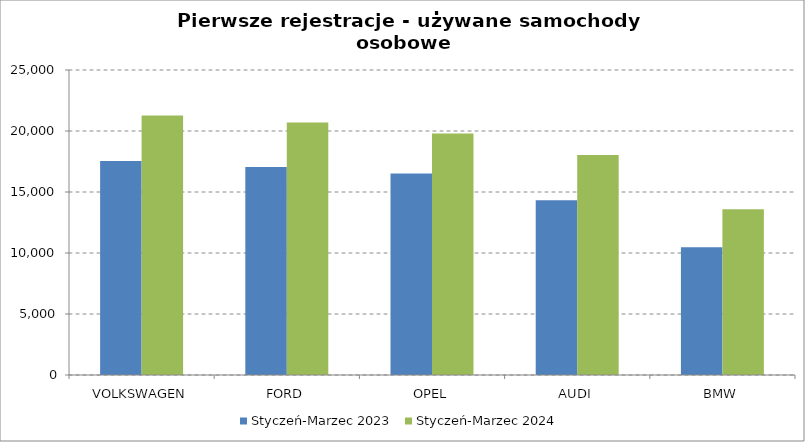
| Category | Styczeń-Marzec 2023 | Styczeń-Marzec 2024 |
|---|---|---|
| VOLKSWAGEN | 17536 | 21273 |
| FORD | 17056 | 20693 |
| OPEL | 16520 | 19799 |
| AUDI | 14329 | 18025 |
| BMW | 10464 | 13576 |